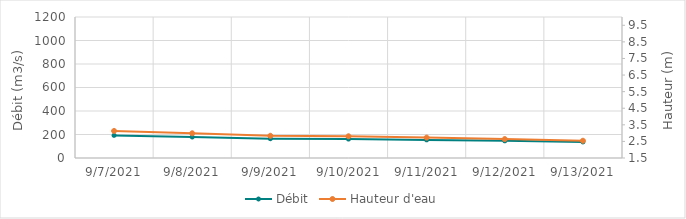
| Category | Débit |
|---|---|
| 6/6/21 | 723.29 |
| 6/5/21 | 742.76 |
| 6/4/21 | 786.92 |
| 6/3/21 | 815.66 |
| 6/2/21 | 837.87 |
| 6/1/21 | 846.58 |
| 5/31/21 | 835.99 |